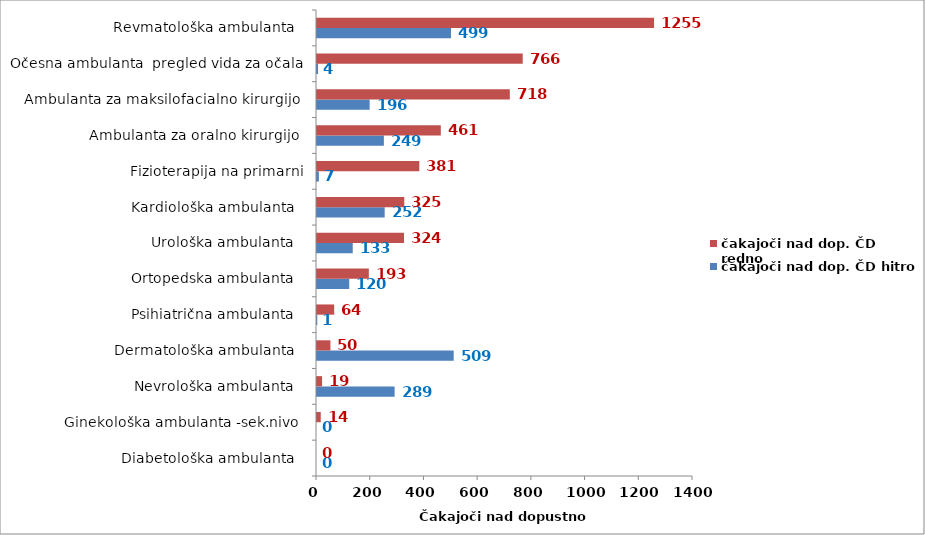
| Category | čakajoči nad dop. ČD hitro | čakajoči nad dop. ČD redno |
|---|---|---|
| Diabetološka ambulanta   | 0 | 0 |
| Ginekološka ambulanta -sek.nivo  | 0 | 14 |
| Nevrološka ambulanta   | 289 | 19 |
| Dermatološka ambulanta   | 509 | 50 |
| Psihiatrična ambulanta   | 1 | 64 |
| Ortopedska ambulanta   | 120 | 193 |
| Urološka ambulanta   | 133 | 324 |
| Kardiološka ambulanta   | 252 | 325 |
| Fizioterapija na primarni | 7 | 381 |
| Ambulanta za oralno kirurgijo  | 249 | 461 |
| Ambulanta za maksilofacialno kirurgijo  | 196 | 718 |
| Očesna ambulanta  pregled vida za očala | 4 | 766 |
| Revmatološka ambulanta   | 499 | 1255 |